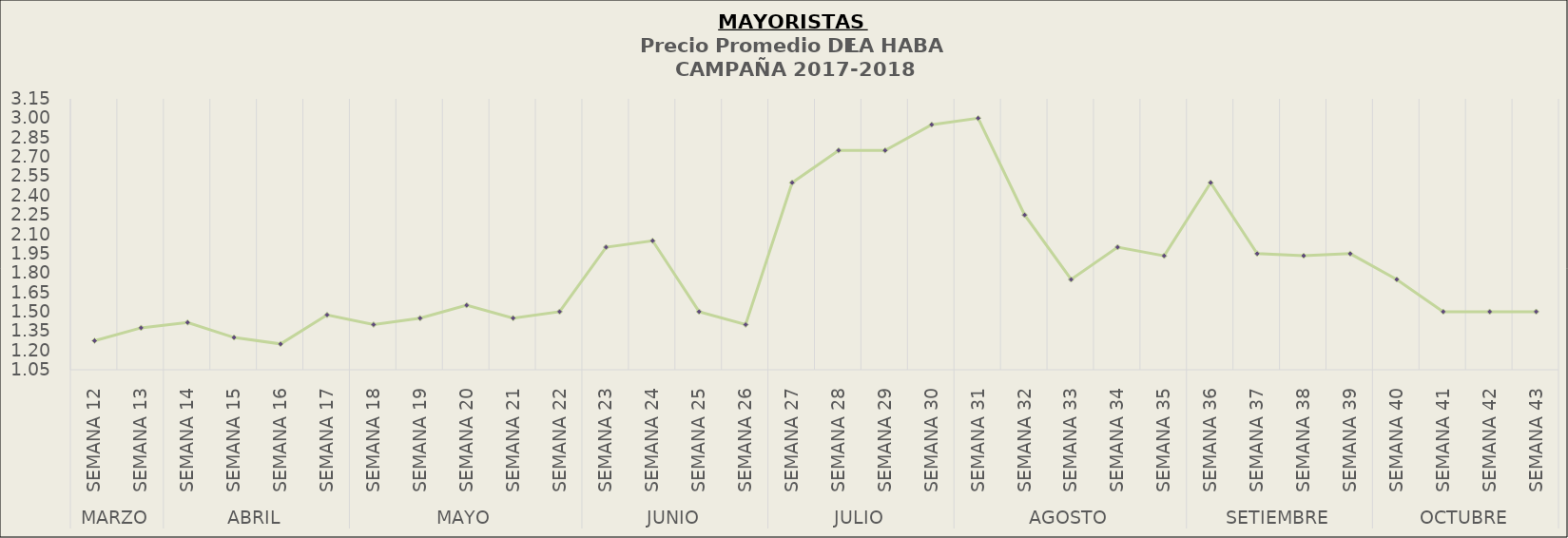
| Category | Precio Promedio ( S/.x Kg.) |
|---|---|
| 0 | 1.275 |
| 1 | 1.375 |
| 2 | 1.417 |
| 3 | 1.3 |
| 4 | 1.25 |
| 5 | 1.475 |
| 6 | 1.4 |
| 7 | 1.45 |
| 8 | 1.55 |
| 9 | 1.45 |
| 10 | 1.5 |
| 11 | 2 |
| 12 | 2.05 |
| 13 | 1.5 |
| 14 | 1.4 |
| 15 | 2.5 |
| 16 | 2.75 |
| 17 | 2.75 |
| 18 | 2.95 |
| 19 | 3 |
| 20 | 2.25 |
| 21 | 1.75 |
| 22 | 2 |
| 23 | 1.933 |
| 24 | 2.5 |
| 25 | 1.95 |
| 26 | 1.933 |
| 27 | 1.95 |
| 28 | 1.75 |
| 29 | 1.5 |
| 30 | 1.5 |
| 31 | 1.5 |